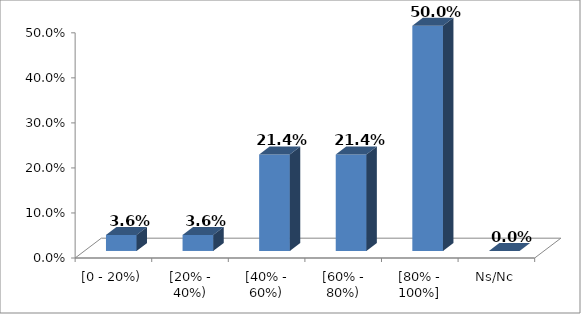
| Category | % |
|---|---|
| [0 - 20%) | 0.036 |
| [20% - 40%) | 0.036 |
| [40% - 60%) | 0.214 |
| [60% - 80%) | 0.214 |
| [80% - 100%] | 0.5 |
| Ns/Nc | 0 |